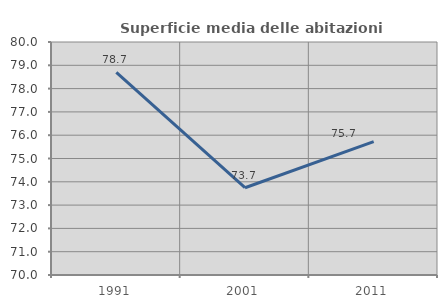
| Category | Superficie media delle abitazioni occupate |
|---|---|
| 1991.0 | 78.701 |
| 2001.0 | 73.745 |
| 2011.0 | 75.727 |